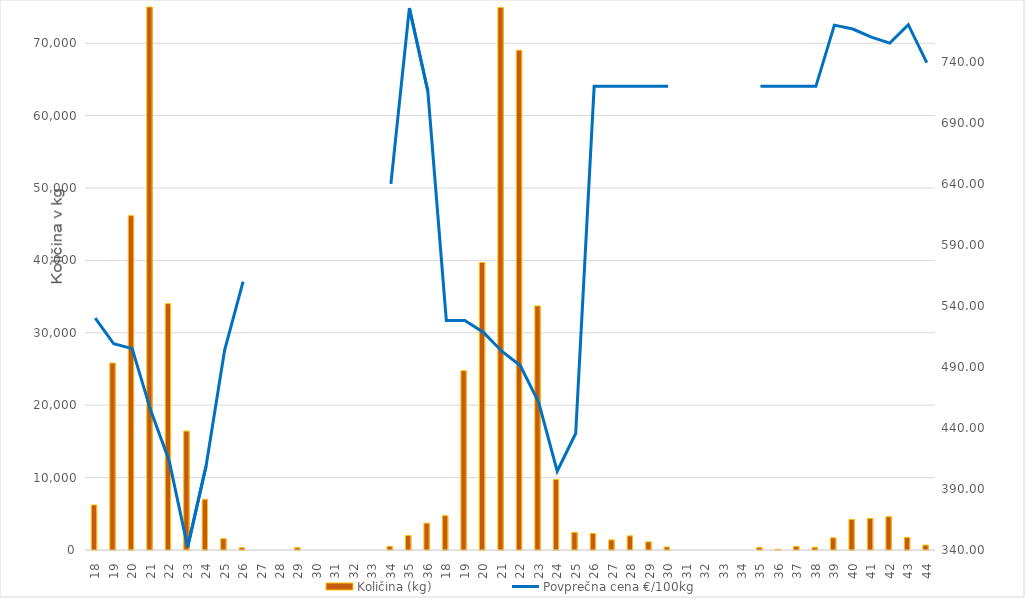
| Category | Količina (kg) |
|---|---|
| 18.0 | 6215 |
| 19.0 | 25826 |
| 20.0 | 46175 |
| 21.0 | 80846 |
| 22.0 | 34028 |
| 23.0 | 16424 |
| 24.0 | 7003 |
| 25.0 | 1562 |
| 26.0 | 320 |
| 27.0 | 0 |
| 28.0 | 0 |
| 29.0 | 316 |
| 30.0 | 0 |
| 31.0 | 0 |
| 32.0 | 0 |
| 33.0 | 0 |
| 34.0 | 512 |
| 35.0 | 1988 |
| 36.0 | 3704 |
| 18.0 | 4735 |
| 19.0 | 24762 |
| 20.0 | 39718 |
| 21.0 | 74927 |
| 22.0 | 69032 |
| 23.0 | 33718 |
| 24.0 | 9744 |
| 25.0 | 2426 |
| 26.0 | 2280 |
| 27.0 | 1396 |
| 28.0 | 1952 |
| 29.0 | 1128 |
| 30.0 | 412 |
| 31.0 | 0 |
| 32.0 | 0 |
| 33.0 | 0 |
| 34.0 | 0 |
| 35.0 | 332 |
| 36.0 | 104 |
| 37.0 | 492 |
| 38.0 | 368 |
| 39.0 | 1682 |
| 40.0 | 4221 |
| 41.0 | 4356 |
| 42.0 | 4596 |
| 43.0 | 1724 |
| 44.0 | 676 |